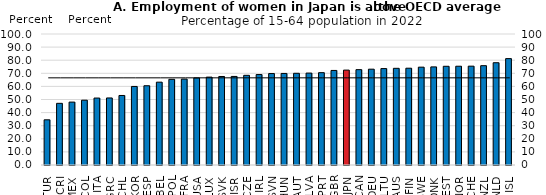
| Category | Women employment rate |
|---|---|
| TUR | 34.5 |
| CRI | 47.067 |
| MEX | 48.01 |
| COL | 49.474 |
| ITA | 51.1 |
| GRC | 51.181 |
| CHL | 53.077 |
| KOR | 59.97 |
| ESP | 60.501 |
| BEL | 63.232 |
| POL | 65.392 |
| FRA | 65.579 |
| USA | 66.472 |
| LUX | 67.083 |
| SVK | 67.567 |
| ISR | 67.614 |
| CZE | 68.459 |
| IRL | 69.043 |
| SVN | 69.807 |
| HUN | 69.888 |
| AUT | 70.01 |
| LVA | 70.167 |
| PRT | 70.486 |
| GBR | 72.181 |
| JPN | 72.444 |
| CAN | 72.788 |
| DEU | 73.14 |
| LTU | 73.593 |
| AUS | 73.806 |
| FIN | 73.881 |
| SWE | 74.679 |
| DNK | 74.881 |
| EST | 75.348 |
| NOR | 75.396 |
| CHE | 75.45 |
| NZL | 75.816 |
| NLD | 78.069 |
| ISL | 81.205 |